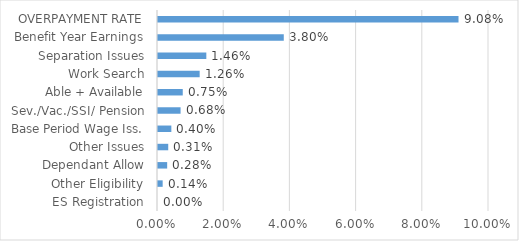
| Category | Series 0 |
|---|---|
| ES Registration | 0 |
| Other Eligibility | 0.001 |
| Dependant Allow | 0.003 |
| Other Issues | 0.003 |
| Base Period Wage Iss. | 0.004 |
| Sev./Vac./SSI/ Pension | 0.007 |
| Able + Available | 0.007 |
| Work Search | 0.013 |
| Separation Issues | 0.015 |
| Benefit Year Earnings | 0.038 |
| OVERPAYMENT RATE | 0.091 |